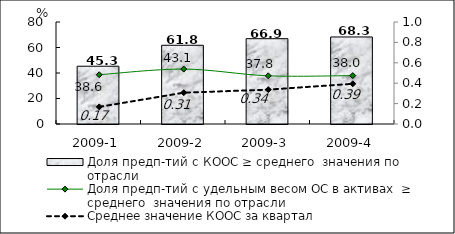
| Category | Доля предп-тий с КООС ≥ среднего  значения по отрасли |
|---|---|
| 2009-1 | 45.31 |
| 2009-2 | 61.75 |
| 2009-3 | 66.92 |
| 2009-4 | 68.27 |